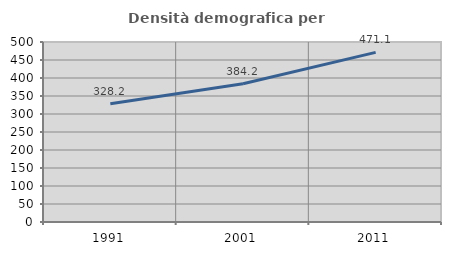
| Category | Densità demografica |
|---|---|
| 1991.0 | 328.181 |
| 2001.0 | 384.25 |
| 2011.0 | 471.121 |